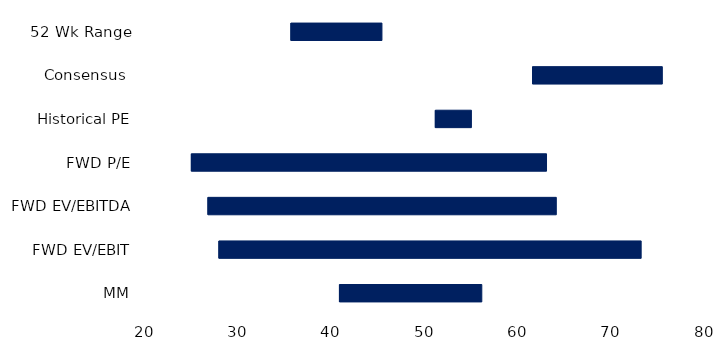
| Category | Series 0 | Series 1 | Series 2 |
|---|---|---|---|
| MM | 40.672 | 15.308 | 55.98 |
| FWD EV/EBIT | 27.755 | 45.298 | 73.053 |
| FWD EV/EBITDA | 26.582 | 37.378 | 63.961 |
| FWD P/E | 24.806 | 38.107 | 62.913 |
| Historical PE | 50.945 | 3.919 | 54.864 |
| Consensus  | 61.36 | 13.96 | 75.32 |
| 52 Wk Range | 35.47 | 9.81 | 45.28 |